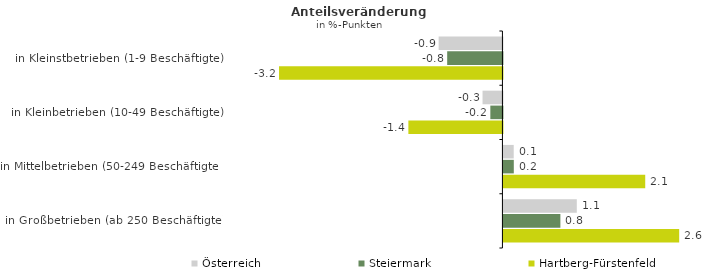
| Category | Österreich | Steiermark | Hartberg-Fürstenfeld |
|---|---|---|---|
| in Kleinstbetrieben (1-9 Beschäftigte) | -0.926 | -0.802 | -3.244 |
| in Kleinbetrieben (10-49 Beschäftigte) | -0.289 | -0.176 | -1.366 |
| in Mittelbetrieben (50-249 Beschäftigte) | 0.149 | 0.151 | 2.059 |
| in Großbetrieben (ab 250 Beschäftigte) | 1.066 | 0.827 | 2.552 |